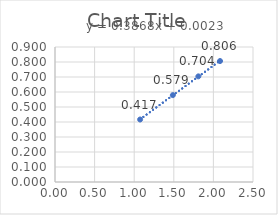
| Category | Series 0 |
|---|---|
| 1.0745666666666667 | 0.417 |
| 1.4878999999999998 | 0.579 |
| 1.81 | 0.704 |
| 2.0839000000000003 | 0.806 |